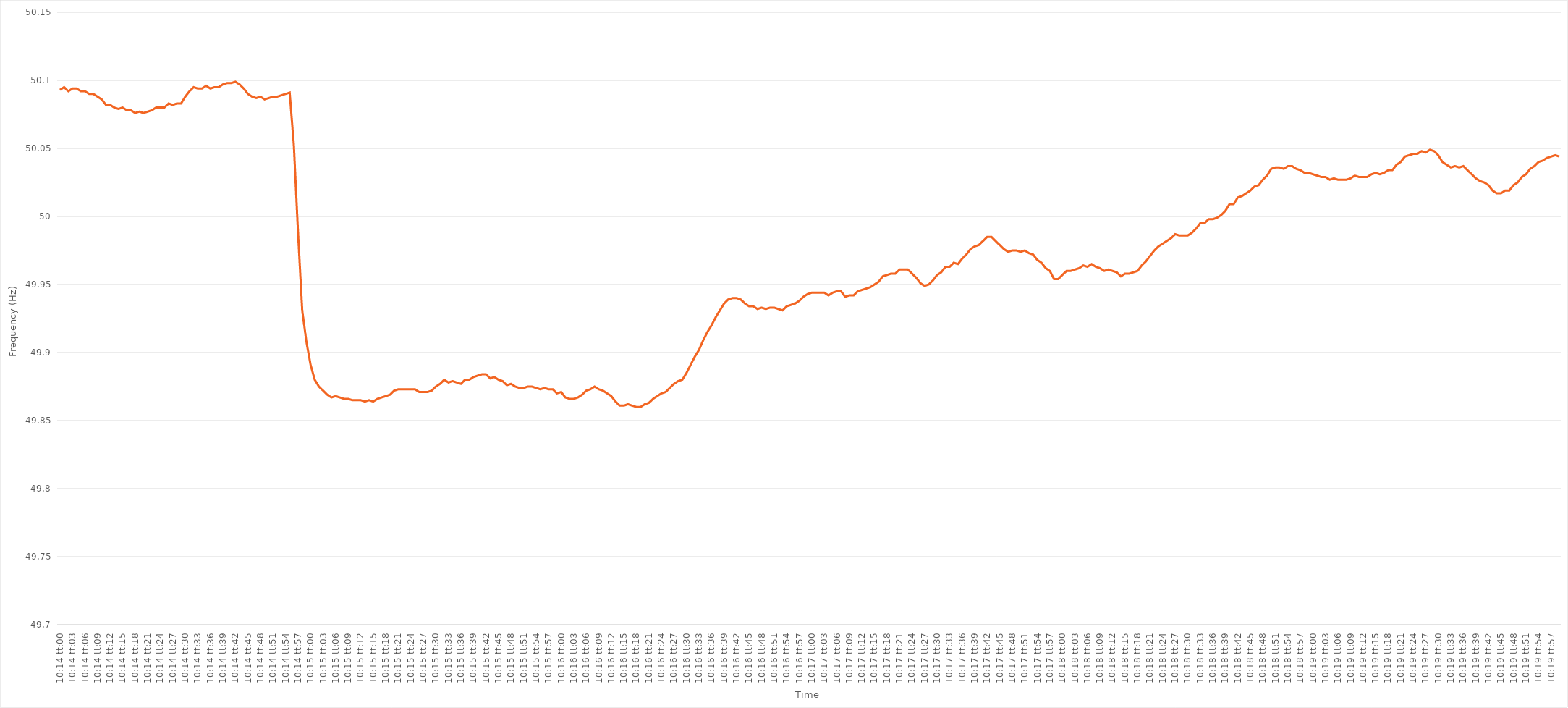
| Category | Series 0 |
|---|---|
| 0.4263888888888889 | 50.093 |
| 0.42640046296296297 | 50.095 |
| 0.426412037037037 | 50.092 |
| 0.4264236111111111 | 50.094 |
| 0.42643518518518514 | 50.094 |
| 0.4264467592592593 | 50.092 |
| 0.42645833333333333 | 50.092 |
| 0.4264699074074074 | 50.09 |
| 0.42648148148148146 | 50.09 |
| 0.42649305555555556 | 50.088 |
| 0.4265046296296296 | 50.086 |
| 0.42651620370370374 | 50.082 |
| 0.4265277777777778 | 50.082 |
| 0.4265393518518519 | 50.08 |
| 0.4265509259259259 | 50.079 |
| 0.4265625 | 50.08 |
| 0.42657407407407405 | 50.078 |
| 0.4265856481481482 | 50.078 |
| 0.42659722222222224 | 50.076 |
| 0.42660879629629633 | 50.077 |
| 0.42662037037037037 | 50.076 |
| 0.4266319444444444 | 50.077 |
| 0.4266435185185185 | 50.078 |
| 0.42665509259259254 | 50.08 |
| 0.4266666666666667 | 50.08 |
| 0.42667824074074073 | 50.08 |
| 0.4266898148148148 | 50.083 |
| 0.42670138888888887 | 50.082 |
| 0.42671296296296296 | 50.083 |
| 0.426724537037037 | 50.083 |
| 0.42673611111111115 | 50.088 |
| 0.4267476851851852 | 50.092 |
| 0.4267592592592593 | 50.095 |
| 0.4267708333333333 | 50.094 |
| 0.4267824074074074 | 50.094 |
| 0.42679398148148145 | 50.096 |
| 0.4268055555555556 | 50.094 |
| 0.42681712962962964 | 50.095 |
| 0.42682870370370374 | 50.095 |
| 0.4268402777777778 | 50.097 |
| 0.4268518518518518 | 50.098 |
| 0.4268634259259259 | 50.098 |
| 0.42687499999999995 | 50.099 |
| 0.4268865740740741 | 50.097 |
| 0.42689814814814814 | 50.094 |
| 0.42690972222222223 | 50.09 |
| 0.42692129629629627 | 50.088 |
| 0.42693287037037037 | 50.087 |
| 0.4269444444444444 | 50.088 |
| 0.42695601851851855 | 50.086 |
| 0.4269675925925926 | 50.087 |
| 0.4269791666666667 | 50.088 |
| 0.4269907407407407 | 50.088 |
| 0.4270023148148148 | 50.089 |
| 0.42701388888888886 | 50.09 |
| 0.427025462962963 | 50.091 |
| 0.42703703703703705 | 50.052 |
| 0.42704861111111114 | 49.988 |
| 0.4270601851851852 | 49.931 |
| 0.4270717592592593 | 49.908 |
| 0.4270833333333333 | 49.891 |
| 0.42709490740740735 | 49.88 |
| 0.4271064814814815 | 49.875 |
| 0.42711805555555554 | 49.872 |
| 0.42712962962962964 | 49.869 |
| 0.4271412037037037 | 49.867 |
| 0.42715277777777777 | 49.868 |
| 0.4271643518518518 | 49.867 |
| 0.42717592592592596 | 49.866 |
| 0.4271875 | 49.866 |
| 0.4271990740740741 | 49.865 |
| 0.42721064814814813 | 49.865 |
| 0.4272222222222222 | 49.865 |
| 0.42723379629629626 | 49.864 |
| 0.4272453703703704 | 49.865 |
| 0.42725694444444445 | 49.864 |
| 0.42726851851851855 | 49.866 |
| 0.4272800925925926 | 49.867 |
| 0.4272916666666667 | 49.868 |
| 0.4273032407407407 | 49.869 |
| 0.42731481481481487 | 49.872 |
| 0.4273263888888889 | 49.873 |
| 0.42733796296296295 | 49.873 |
| 0.42734953703703704 | 49.873 |
| 0.4273611111111111 | 49.873 |
| 0.4273726851851852 | 49.873 |
| 0.4273842592592592 | 49.871 |
| 0.42739583333333336 | 49.871 |
| 0.4274074074074074 | 49.871 |
| 0.4274189814814815 | 49.872 |
| 0.42743055555555554 | 49.875 |
| 0.42744212962962963 | 49.877 |
| 0.42745370370370367 | 49.88 |
| 0.4274652777777778 | 49.878 |
| 0.42747685185185186 | 49.879 |
| 0.42748842592592595 | 49.878 |
| 0.4275 | 49.877 |
| 0.4275115740740741 | 49.88 |
| 0.4275231481481481 | 49.88 |
| 0.4275347222222223 | 49.882 |
| 0.4275462962962963 | 49.883 |
| 0.42755787037037035 | 49.884 |
| 0.42756944444444445 | 49.884 |
| 0.4275810185185185 | 49.881 |
| 0.4275925925925926 | 49.882 |
| 0.4276041666666666 | 49.88 |
| 0.42761574074074077 | 49.879 |
| 0.4276273148148148 | 49.876 |
| 0.4276388888888889 | 49.877 |
| 0.42765046296296294 | 49.875 |
| 0.42766203703703703 | 49.874 |
| 0.4276736111111111 | 49.874 |
| 0.4276851851851852 | 49.875 |
| 0.42769675925925926 | 49.875 |
| 0.42770833333333336 | 49.874 |
| 0.4277199074074074 | 49.873 |
| 0.4277314814814815 | 49.874 |
| 0.42774305555555553 | 49.873 |
| 0.4277546296296297 | 49.873 |
| 0.4277662037037037 | 49.87 |
| 0.4277777777777778 | 49.871 |
| 0.42778935185185185 | 49.867 |
| 0.42780092592592595 | 49.866 |
| 0.4278125 | 49.866 |
| 0.427824074074074 | 49.867 |
| 0.4278356481481482 | 49.869 |
| 0.4278472222222222 | 49.872 |
| 0.4278587962962963 | 49.873 |
| 0.42787037037037035 | 49.875 |
| 0.42788194444444444 | 49.873 |
| 0.4278935185185185 | 49.872 |
| 0.42790509259259263 | 49.87 |
| 0.42791666666666667 | 49.868 |
| 0.42792824074074076 | 49.864 |
| 0.4279398148148148 | 49.861 |
| 0.4279513888888889 | 49.861 |
| 0.42796296296296293 | 49.862 |
| 0.4279745370370371 | 49.861 |
| 0.4279861111111111 | 49.86 |
| 0.4279976851851852 | 49.86 |
| 0.42800925925925926 | 49.862 |
| 0.42802083333333335 | 49.863 |
| 0.4280324074074074 | 49.866 |
| 0.42804398148148143 | 49.868 |
| 0.4280555555555556 | 49.87 |
| 0.4280671296296296 | 49.871 |
| 0.4280787037037037 | 49.874 |
| 0.42809027777777775 | 49.877 |
| 0.42810185185185184 | 49.879 |
| 0.4281134259259259 | 49.88 |
| 0.42812500000000003 | 49.885 |
| 0.42813657407407407 | 49.891 |
| 0.42814814814814817 | 49.897 |
| 0.4281597222222222 | 49.902 |
| 0.4281712962962963 | 49.909 |
| 0.42818287037037034 | 49.915 |
| 0.4281944444444445 | 49.92 |
| 0.4282060185185185 | 49.926 |
| 0.4282175925925926 | 49.931 |
| 0.42822916666666666 | 49.936 |
| 0.42824074074074076 | 49.939 |
| 0.4282523148148148 | 49.94 |
| 0.42826388888888883 | 49.94 |
| 0.428275462962963 | 49.939 |
| 0.428287037037037 | 49.936 |
| 0.4282986111111111 | 49.934 |
| 0.42831018518518515 | 49.934 |
| 0.42832175925925925 | 49.932 |
| 0.4283333333333333 | 49.933 |
| 0.42834490740740744 | 49.932 |
| 0.4283564814814815 | 49.933 |
| 0.42836805555555557 | 49.933 |
| 0.4283796296296296 | 49.932 |
| 0.4283912037037037 | 49.931 |
| 0.42840277777777774 | 49.934 |
| 0.4284143518518519 | 49.935 |
| 0.42842592592592593 | 49.936 |
| 0.4284375 | 49.938 |
| 0.42844907407407407 | 49.941 |
| 0.42846064814814816 | 49.943 |
| 0.4284722222222222 | 49.944 |
| 0.42848379629629635 | 49.944 |
| 0.4284953703703704 | 49.944 |
| 0.4285069444444445 | 49.944 |
| 0.4285185185185185 | 49.942 |
| 0.42853009259259256 | 49.944 |
| 0.42854166666666665 | 49.945 |
| 0.4285532407407407 | 49.945 |
| 0.42856481481481484 | 49.941 |
| 0.4285763888888889 | 49.942 |
| 0.428587962962963 | 49.942 |
| 0.428599537037037 | 49.945 |
| 0.4286111111111111 | 49.946 |
| 0.42862268518518515 | 49.947 |
| 0.4286342592592593 | 49.948 |
| 0.42864583333333334 | 49.95 |
| 0.42865740740740743 | 49.952 |
| 0.42866898148148147 | 49.956 |
| 0.42868055555555556 | 49.957 |
| 0.4286921296296296 | 49.958 |
| 0.42870370370370375 | 49.958 |
| 0.4287152777777778 | 49.961 |
| 0.4287268518518519 | 49.961 |
| 0.4287384259259259 | 49.961 |
| 0.42874999999999996 | 49.958 |
| 0.42876157407407406 | 49.955 |
| 0.4287731481481481 | 49.951 |
| 0.42878472222222225 | 49.949 |
| 0.4287962962962963 | 49.95 |
| 0.4288078703703704 | 49.953 |
| 0.4288194444444444 | 49.957 |
| 0.4288310185185185 | 49.959 |
| 0.42884259259259255 | 49.963 |
| 0.4288541666666667 | 49.963 |
| 0.42886574074074074 | 49.966 |
| 0.42887731481481484 | 49.965 |
| 0.4288888888888889 | 49.969 |
| 0.42890046296296297 | 49.972 |
| 0.428912037037037 | 49.976 |
| 0.42892361111111116 | 49.978 |
| 0.4289351851851852 | 49.979 |
| 0.4289467592592593 | 49.982 |
| 0.42895833333333333 | 49.985 |
| 0.42896990740740737 | 49.985 |
| 0.42898148148148146 | 49.982 |
| 0.4289930555555555 | 49.979 |
| 0.42900462962962965 | 49.976 |
| 0.4290162037037037 | 49.974 |
| 0.4290277777777778 | 49.975 |
| 0.4290393518518518 | 49.975 |
| 0.4290509259259259 | 49.974 |
| 0.42906249999999996 | 49.975 |
| 0.4290740740740741 | 49.973 |
| 0.42908564814814815 | 49.972 |
| 0.42909722222222224 | 49.968 |
| 0.4291087962962963 | 49.966 |
| 0.4291203703703704 | 49.962 |
| 0.4291319444444444 | 49.96 |
| 0.42914351851851856 | 49.954 |
| 0.4291550925925926 | 49.954 |
| 0.4291666666666667 | 49.957 |
| 0.42917824074074074 | 49.96 |
| 0.42918981481481483 | 49.96 |
| 0.42920138888888887 | 49.961 |
| 0.429212962962963 | 49.962 |
| 0.42922453703703706 | 49.964 |
| 0.4292361111111111 | 49.963 |
| 0.4292476851851852 | 49.965 |
| 0.42925925925925923 | 49.963 |
| 0.4292708333333333 | 49.962 |
| 0.42928240740740736 | 49.96 |
| 0.4292939814814815 | 49.961 |
| 0.42930555555555555 | 49.96 |
| 0.42931712962962965 | 49.959 |
| 0.4293287037037037 | 49.956 |
| 0.4293402777777778 | 49.958 |
| 0.4293518518518518 | 49.958 |
| 0.42936342592592597 | 49.959 |
| 0.429375 | 49.96 |
| 0.4293865740740741 | 49.964 |
| 0.42939814814814814 | 49.967 |
| 0.42940972222222223 | 49.971 |
| 0.4294212962962963 | 49.975 |
| 0.4294328703703704 | 49.978 |
| 0.42944444444444446 | 49.98 |
| 0.4294560185185185 | 49.982 |
| 0.4294675925925926 | 49.984 |
| 0.42947916666666663 | 49.987 |
| 0.42949074074074073 | 49.986 |
| 0.42950231481481477 | 49.986 |
| 0.4295138888888889 | 49.986 |
| 0.42952546296296296 | 49.988 |
| 0.42953703703703705 | 49.991 |
| 0.4295486111111111 | 49.995 |
| 0.4295601851851852 | 49.995 |
| 0.4295717592592592 | 49.998 |
| 0.4295833333333334 | 49.998 |
| 0.4295949074074074 | 49.999 |
| 0.4296064814814815 | 50.001 |
| 0.42961805555555554 | 50.004 |
| 0.42962962962962964 | 50.009 |
| 0.4296412037037037 | 50.009 |
| 0.42965277777777783 | 50.014 |
| 0.42966435185185187 | 50.015 |
| 0.42967592592592596 | 50.017 |
| 0.4296875 | 50.019 |
| 0.42969907407407404 | 50.022 |
| 0.42971064814814813 | 50.023 |
| 0.42972222222222217 | 50.027 |
| 0.4297337962962963 | 50.03 |
| 0.42974537037037036 | 50.035 |
| 0.42975694444444446 | 50.036 |
| 0.4297685185185185 | 50.036 |
| 0.4297800925925926 | 50.035 |
| 0.4297916666666666 | 50.037 |
| 0.4298032407407408 | 50.037 |
| 0.4298148148148148 | 50.035 |
| 0.4298263888888889 | 50.034 |
| 0.42983796296296295 | 50.032 |
| 0.42984953703703704 | 50.032 |
| 0.4298611111111111 | 50.031 |
| 0.42987268518518523 | 50.03 |
| 0.42988425925925927 | 50.029 |
| 0.42989583333333337 | 50.029 |
| 0.4299074074074074 | 50.027 |
| 0.4299189814814815 | 50.028 |
| 0.42993055555555554 | 50.027 |
| 0.4299421296296296 | 50.027 |
| 0.4299537037037037 | 50.027 |
| 0.42996527777777777 | 50.028 |
| 0.42997685185185186 | 50.03 |
| 0.4299884259259259 | 50.029 |
| 0.43 | 50.029 |
| 0.43001157407407403 | 50.029 |
| 0.4300231481481482 | 50.031 |
| 0.4300347222222222 | 50.032 |
| 0.4300462962962963 | 50.031 |
| 0.43005787037037035 | 50.032 |
| 0.43006944444444445 | 50.034 |
| 0.4300810185185185 | 50.034 |
| 0.43009259259259264 | 50.038 |
| 0.4301041666666667 | 50.04 |
| 0.43011574074074077 | 50.044 |
| 0.4301273148148148 | 50.045 |
| 0.4301388888888889 | 50.046 |
| 0.43015046296296294 | 50.046 |
| 0.430162037037037 | 50.048 |
| 0.43017361111111113 | 50.047 |
| 0.43018518518518517 | 50.049 |
| 0.43019675925925926 | 50.048 |
| 0.4302083333333333 | 50.045 |
| 0.4302199074074074 | 50.04 |
| 0.43023148148148144 | 50.038 |
| 0.4302430555555556 | 50.036 |
| 0.4302546296296296 | 50.037 |
| 0.4302662037037037 | 50.036 |
| 0.43027777777777776 | 50.037 |
| 0.43028935185185185 | 50.034 |
| 0.4303009259259259 | 50.031 |
| 0.43031250000000004 | 50.028 |
| 0.4303240740740741 | 50.026 |
| 0.4303356481481482 | 50.025 |
| 0.4303472222222222 | 50.023 |
| 0.4303587962962963 | 50.019 |
| 0.43037037037037035 | 50.017 |
| 0.4303819444444445 | 50.017 |
| 0.43039351851851854 | 50.019 |
| 0.43040509259259263 | 50.019 |
| 0.43041666666666667 | 50.023 |
| 0.4304282407407407 | 50.025 |
| 0.4304398148148148 | 50.029 |
| 0.43045138888888884 | 50.031 |
| 0.430462962962963 | 50.035 |
| 0.43047453703703703 | 50.037 |
| 0.4304861111111111 | 50.04 |
| 0.43049768518518516 | 50.041 |
| 0.43050925925925926 | 50.043 |
| 0.4305208333333333 | 50.044 |
| 0.43053240740740745 | 50.045 |
| 0.4305439814814815 | 50.044 |